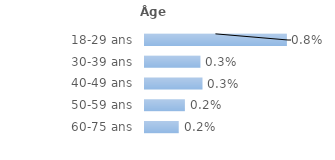
| Category | Series 0 |
|---|---|
| 18-29 ans | 0.008 |
| 30-39 ans | 0.003 |
| 40-49 ans | 0.003 |
| 50-59 ans | 0.002 |
| 60-75 ans | 0.002 |